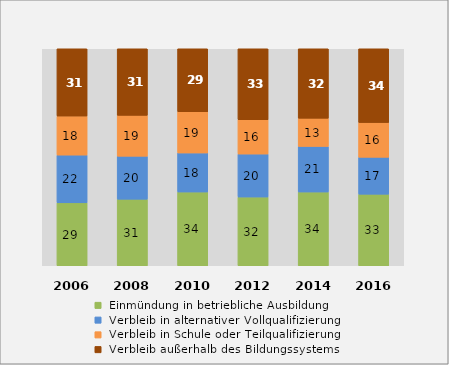
| Category |  Einmündung in betriebliche Ausbildung |  Verbleib in alternativer Vollqualifizierung |  Verbleib in Schule oder Teilqualifizierung |  Verbleib außerhalb des Bildungssystems |
|---|---|---|---|---|
| 2006.0 | 29 | 22 | 18 | 31 |
| 2008.0 | 31 | 20 | 19 | 31 |
| 2010.0 | 34 | 18 | 19 | 29 |
| 2012.0 | 32 | 20 | 16 | 33 |
| 2014.0 | 34 | 21 | 13 | 32 |
| 2016.0 | 33 | 17 | 16 | 34 |